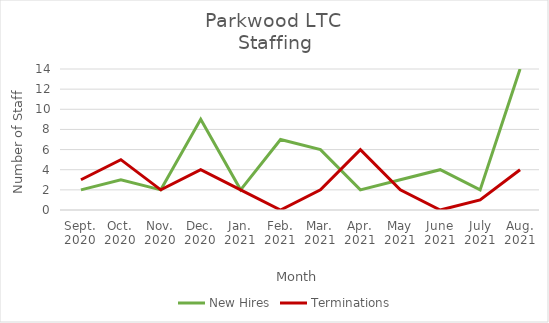
| Category | New Hires | Terminations |
|---|---|---|
| Sept.
2020 | 2 | 3 |
| Oct.
2020 | 3 | 5 |
| Nov.
2020 | 2 | 2 |
| Dec.
2020 | 9 | 4 |
| Jan.
2021 | 2 | 2 |
| Feb.
2021 | 7 | 0 |
| Mar.
2021 | 6 | 2 |
| Apr.
2021 | 2 | 6 |
| May
2021 | 3 | 2 |
| June
2021 | 4 | 0 |
| July
2021 | 2 | 1 |
| Aug.
2021 | 14 | 4 |